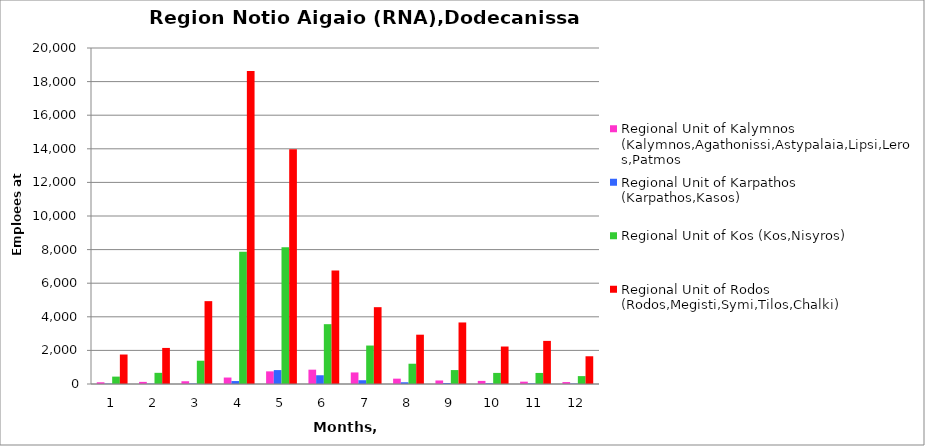
| Category | Regional Unit of Kalymnos (Kalymnos,Agathonissi,Astypalaia,Lipsi,Leros,Patmos | Regional Unit of Karpathos (Karpathos,Kasos) | Regional Unit of Kos (Kos,Nisyros) | Regional Unit of Rodos (Rodos,Megisti,Symi,Tilos,Chalki) |
|---|---|---|---|---|
| 0 | 102 | 19 | 440 | 1755 |
| 1 | 126 | 17 | 665 | 2147 |
| 2 | 164 | 25 | 1386 | 4932 |
| 3 | 385 | 176 | 7876 | 18635 |
| 4 | 752 | 828 | 8134 | 13980 |
| 5 | 853 | 521 | 3561 | 6759 |
| 6 | 688 | 225 | 2289 | 4573 |
| 7 | 318 | 104 | 1207 | 2935 |
| 8 | 210 | 56 | 829 | 3663 |
| 9 | 185 | 41 | 660 | 2231 |
| 10 | 139 | 31 | 658 | 2566 |
| 11 | 115 | 23 | 470 | 1651 |